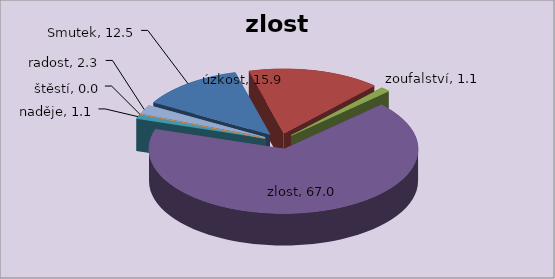
| Category | zlost |
|---|---|
| Smutek | 12.5 |
| úzkost | 15.909 |
| zoufalství | 1.136 |
| zlost | 67.045 |
| naděje | 1.136 |
| štěstí | 0 |
| radost | 2.273 |